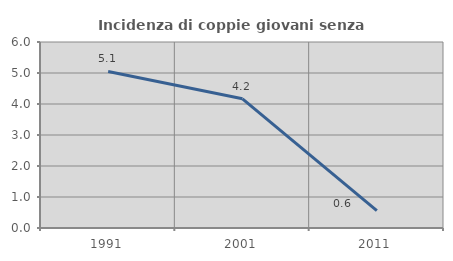
| Category | Incidenza di coppie giovani senza figli |
|---|---|
| 1991.0 | 5.051 |
| 2001.0 | 4.167 |
| 2011.0 | 0.562 |